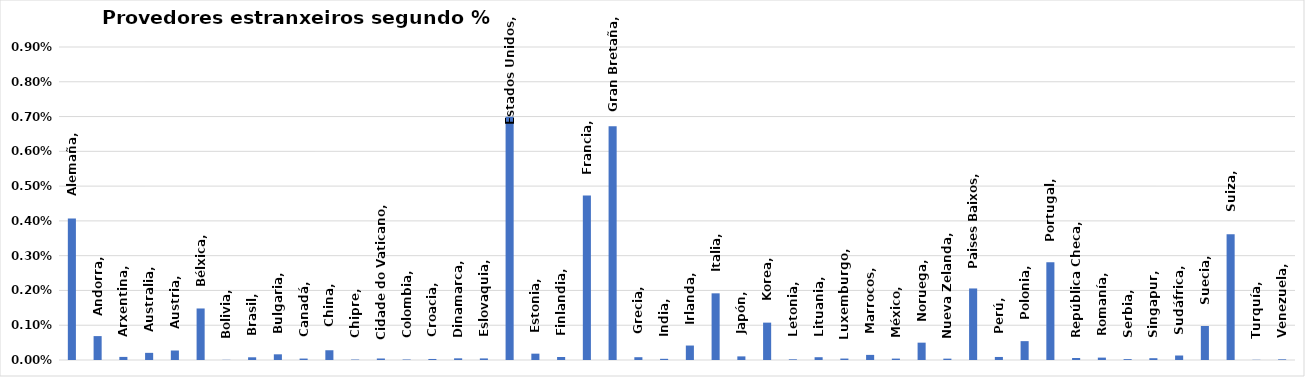
| Category | Series 0 |
|---|---|
| Alemaña | 0.004 |
| Andorra | 0.001 |
| Arxentina | 0 |
| Australia | 0 |
| Austria | 0 |
| Bélxica | 0.001 |
| Bolivia | 0 |
| Brasil | 0 |
| Bulgaria | 0 |
| Canadá | 0 |
| China | 0 |
| Chipre | 0 |
| Cidade do Vaticano | 0 |
| Colombia | 0 |
| Croacia | 0 |
| Dinamarca | 0 |
| Eslovaquia | 0 |
| Estados Unidos | 0.007 |
| Estonia | 0 |
| Finlandia | 0 |
| Francia | 0.005 |
| Gran Bretaña | 0.007 |
| Grecia | 0 |
| India | 0 |
| Irlanda | 0 |
| Italia | 0.002 |
| Japón | 0 |
| Korea | 0.001 |
| Letonia | 0 |
| Lituania | 0 |
| Luxemburgo | 0 |
| Marrocos | 0 |
| México | 0 |
| Noruega | 0 |
| Nueva Zelanda | 0 |
| Paises Baixos | 0.002 |
| Perú | 0 |
| Polonia | 0.001 |
| Portugal | 0.003 |
| República Checa | 0 |
| Romanía | 0 |
| Serbia | 0 |
| Singapur | 0 |
| Sudáfrica | 0 |
| Suecia | 0.001 |
| Suiza | 0.004 |
| Turquía | 0 |
| Venezuela | 0 |